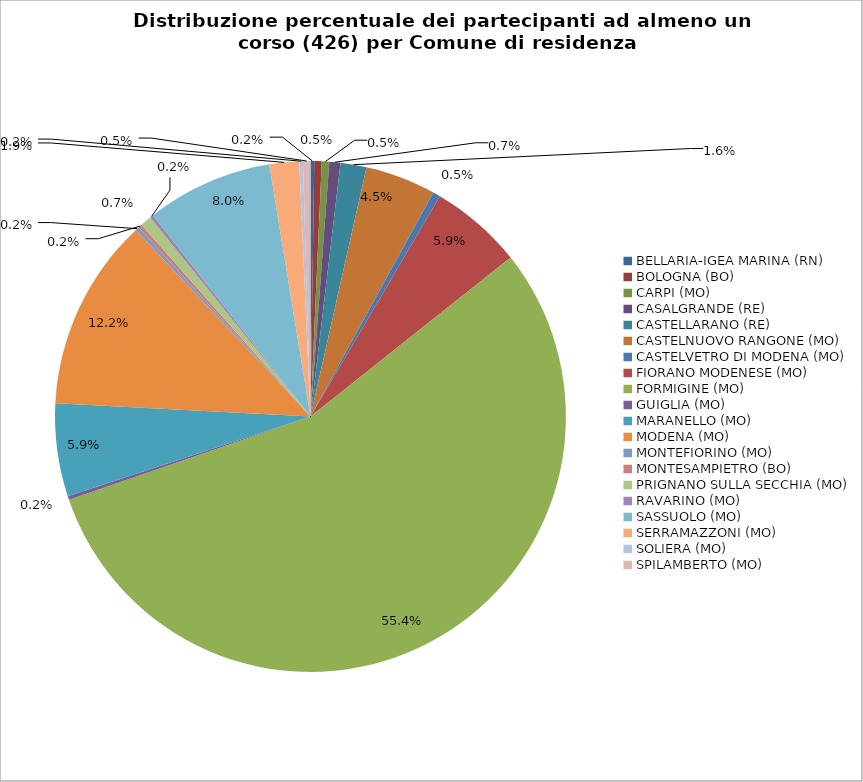
| Category | Nr. Tesserati |
|---|---|
| BELLARIA-IGEA MARINA (RN) | 1 |
| BOLOGNA (BO) | 2 |
| CARPI (MO) | 2 |
| CASALGRANDE (RE) | 3 |
| CASTELLARANO (RE) | 7 |
| CASTELNUOVO RANGONE (MO) | 19 |
| CASTELVETRO DI MODENA (MO) | 2 |
| FIORANO MODENESE (MO) | 25 |
| FORMIGINE (MO) | 236 |
| GUIGLIA (MO) | 1 |
| MARANELLO (MO) | 25 |
| MODENA (MO) | 52 |
| MONTEFIORINO (MO) | 1 |
| MONTESAMPIETRO (BO) | 1 |
| PRIGNANO SULLA SECCHIA (MO) | 3 |
| RAVARINO (MO) | 1 |
| SASSUOLO (MO) | 34 |
| SERRAMAZZONI (MO) | 8 |
| SOLIERA (MO) | 1 |
| SPILAMBERTO (MO) | 2 |